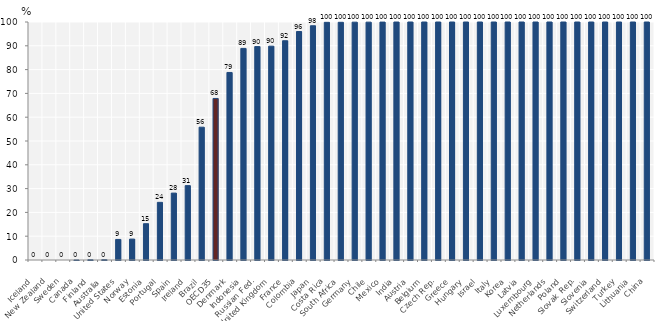
| Category | Series 0 |
|---|---|
| Iceland | 0 |
| New Zealand | 0 |
| Sweden | 0 |
| Canada | 0.01 |
| Finland | 0.1 |
| Australia | 0.14 |
| United States | 8.64 |
| Norway | 8.78 |
| Estonia | 15.25 |
| Portugal | 24.22 |
| Spain | 28.11 |
| Ireland | 31.25 |
| Brazil | 55.8 |
| OECD35 | 67.872 |
| Denmark | 78.8 |
| Indonesia | 88.91 |
| Russian Fed. | 89.66 |
| United Kingdom | 89.84 |
| France | 92.13 |
| Colombia | 96 |
| Japan | 98.42 |
| Costa Rica | 99.86 |
| South Africa | 99.87 |
| Germany | 99.93 |
| Chile | 99.94 |
| Mexico | 99.96 |
| India | 99.99 |
| Austria | 100 |
| Belgium | 100 |
| Czech Rep. | 100 |
| Greece | 100 |
| Hungary | 100 |
| Israel | 100 |
| Italy | 100 |
| Korea | 100 |
| Latvia | 100 |
| Luxembourg | 100 |
| Netherlands | 100 |
| Poland | 100 |
| Slovak Rep. | 100 |
| Slovenia | 100 |
| Switzerland | 100 |
| Turkey | 100 |
| Lithuania | 100 |
| China | 100 |